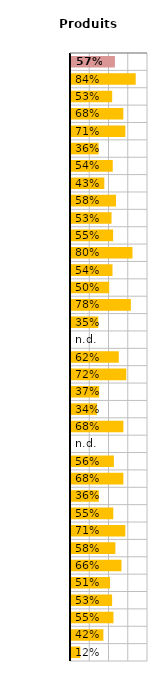
| Category | Produits pharmaceutiques |
|---|---|
| OCDE32 | 0.57 |
| Allemagne | 0.84 |
| Australie | 0.535 |
| Autriche | 0.68 |
| Belgique | 0.706 |
| Canada | 0.358 |
| Corée | 0.542 |
| Danemark | 0.433 |
| Espagne | 0.584 |
| Estonie | 0.526 |
| Finlande | 0.547 |
| France | 0.799 |
| Grèce | 0.539 |
| Hongrie | 0.496 |
| Irlande | 0.777 |
| Islande | 0.354 |
| Israël | 0 |
| Italie | 0.621 |
| Japon | 0.718 |
| Lettonie | 0.366 |
| Lituanie | 0.338 |
| Luxembourg | 0.681 |
| Mexique | 0 |
| Norvège | 0.557 |
| Pays-Bas | 0.68 |
| Pologne | 0.361 |
| Portugal | 0.549 |
| République slovaque | 0.705 |
| République tchèque | 0.576 |
| Royaume-Uni | 0.655 |
| Slovénie | 0.507 |
| Suède | 0.534 |